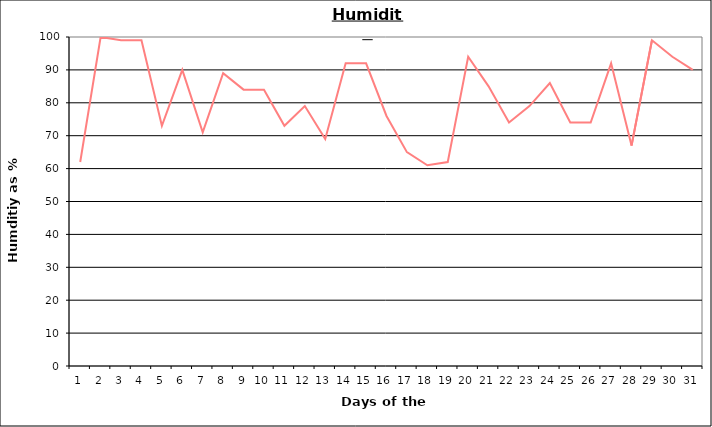
| Category | Series 0 |
|---|---|
| 0 | 62 |
| 1 | 100 |
| 2 | 99 |
| 3 | 99 |
| 4 | 73 |
| 5 | 90 |
| 6 | 71 |
| 7 | 89 |
| 8 | 84 |
| 9 | 84 |
| 10 | 73 |
| 11 | 79 |
| 12 | 69 |
| 13 | 92 |
| 14 | 92 |
| 15 | 76 |
| 16 | 65 |
| 17 | 61 |
| 18 | 62 |
| 19 | 94 |
| 20 | 85 |
| 21 | 74 |
| 22 | 79 |
| 23 | 86 |
| 24 | 74 |
| 25 | 74 |
| 26 | 92 |
| 27 | 67 |
| 28 | 99 |
| 29 | 94 |
| 30 | 90 |